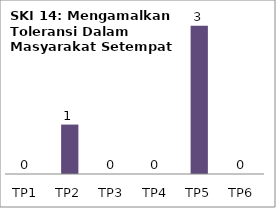
| Category | Bil Pel |
|---|---|
| TP1 | 0 |
| TP2 | 1 |
| TP3 | 0 |
| TP4 | 0 |
| TP5 | 3 |
| TP6 | 0 |